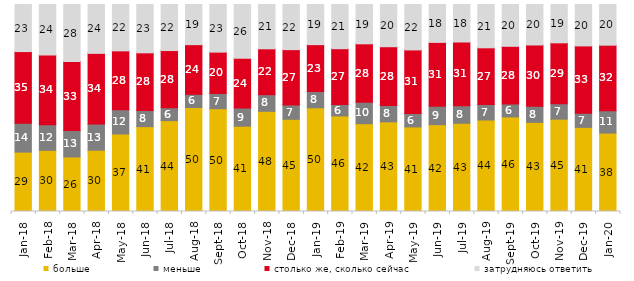
| Category | больше | меньше | столько же, сколько сейчас | затрудняюсь ответить |
|---|---|---|---|---|
| 2018-01-01 | 28.7 | 13.9 | 34.65 | 22.75 |
| 2018-02-01 | 29.55 | 12.4 | 33.7 | 24.35 |
| 2018-03-01 | 26.35 | 12.75 | 33.35 | 27.55 |
| 2018-04-01 | 29.6 | 12.7 | 34.1 | 23.6 |
| 2018-05-01 | 37.45 | 11.7 | 28.45 | 22.4 |
| 2018-06-01 | 41 | 7.8 | 27.85 | 23.35 |
| 2018-07-01 | 43.9 | 6.25 | 27.6 | 22.25 |
| 2018-08-01 | 50.25 | 6.35 | 24 | 19.4 |
| 2018-09-01 | 49.65 | 7.35 | 19.95 | 23 |
| 2018-10-01 | 41.2 | 8.85 | 23.95 | 26 |
| 2018-11-01 | 48.403 | 8.034 | 22.156 | 21.407 |
| 2018-12-01 | 44.55 | 6.95 | 26.7 | 21.8 |
| 2019-01-01 | 50.1 | 7.85 | 22.65 | 19.4 |
| 2019-02-01 | 46.15 | 5.6 | 26.9 | 21.35 |
| 2019-03-01 | 42.417 | 10.343 | 28.245 | 18.996 |
| 2019-04-01 | 43.317 | 7.871 | 28.416 | 20.396 |
| 2019-05-01 | 40.862 | 6.439 | 30.758 | 21.942 |
| 2019-06-01 | 41.945 | 8.878 | 30.873 | 18.304 |
| 2019-07-01 | 42.624 | 8.465 | 30.792 | 18.119 |
| 2019-08-01 | 44.206 | 7.493 | 27.373 | 20.929 |
| 2019-09-01 | 45.693 | 6.287 | 27.822 | 20.198 |
| 2019-10-01 | 43.069 | 7.723 | 29.653 | 19.554 |
| 2019-11-01 | 44.604 | 7.426 | 29.455 | 18.515 |
| 2019-12-01 | 40.644 | 6.782 | 32.574 | 20 |
| 2020-01-01 | 37.871 | 10.842 | 31.634 | 19.653 |